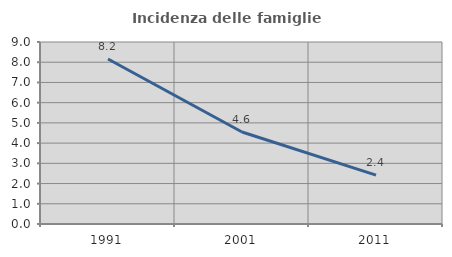
| Category | Incidenza delle famiglie numerose |
|---|---|
| 1991.0 | 8.16 |
| 2001.0 | 4.55 |
| 2011.0 | 2.417 |